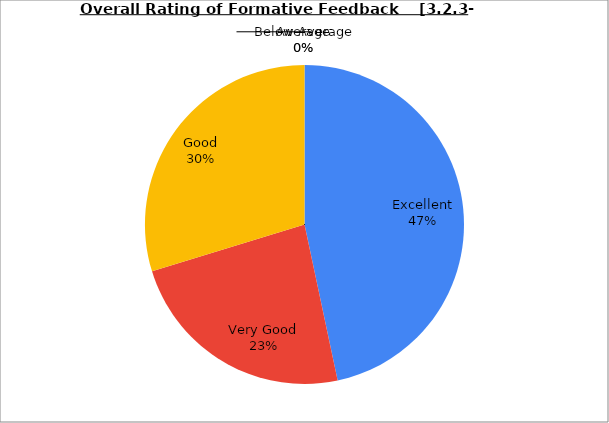
| Category | Series 0 |
|---|---|
| Excellent | 46.667 |
| Very Good | 23.59 |
| Good | 29.744 |
| Average | 0 |
| Below Average | 0 |